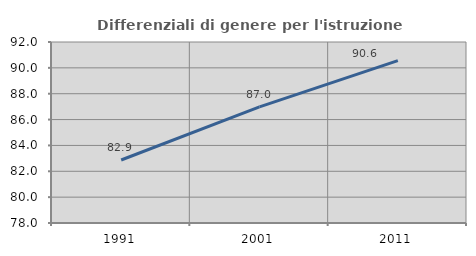
| Category | Differenziali di genere per l'istruzione superiore |
|---|---|
| 1991.0 | 82.871 |
| 2001.0 | 86.978 |
| 2011.0 | 90.561 |